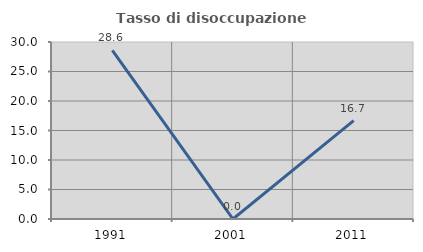
| Category | Tasso di disoccupazione giovanile  |
|---|---|
| 1991.0 | 28.571 |
| 2001.0 | 0 |
| 2011.0 | 16.667 |